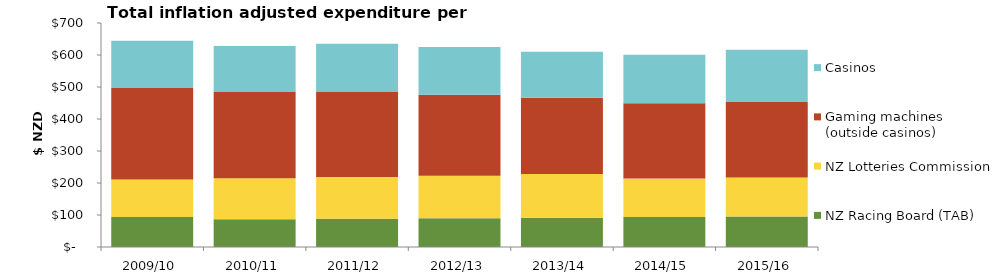
| Category | NZ Racing Board (TAB) | NZ Lotteries Commission | Gaming machines (outside casinos) | Casinos |
|---|---|---|---|---|
| 2009/10 | 93.791 | 116.778 | 286.086 | 148.168 |
| 2010/11 | 86.458 | 128.194 | 271.33 | 142.094 |
| 2011/12 | 88.152 | 130.456 | 266.044 | 150.371 |
| 2012/13 | 90.096 | 132.204 | 253.12 | 149.884 |
| 2013/14 | 91.632 | 136.799 | 238.191 | 143.474 |
| 2014/15 | 93.403 | 120.795 | 235.083 | 151.462 |
| 2015/16 | 95.5 | 121.997 | 235.333 | 163.39 |